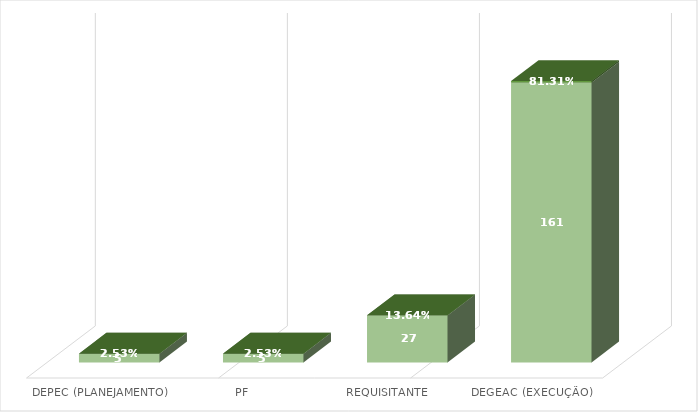
| Category | Contagem de Pedido nº | Contagem de Pedido nº2 |
|---|---|---|
| DEPEC (PLANEJAMENTO) | 5 | 0.025 |
| PF | 5 | 0.025 |
| REQUISITANTE | 27 | 0.136 |
| DEGEAC (EXECUÇÃO) | 161 | 0.813 |